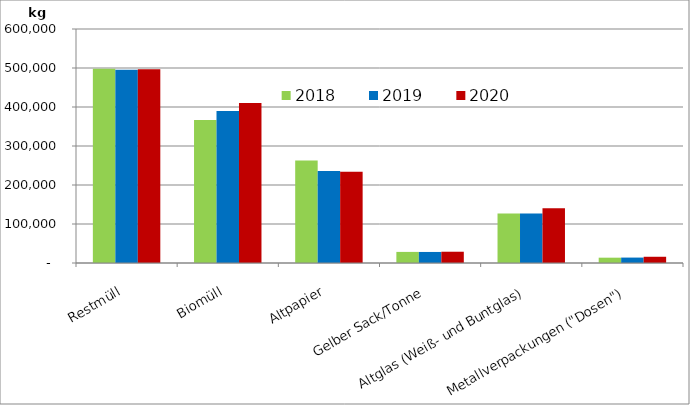
| Category | 2018 | 2019 | 2020 |
|---|---|---|---|
| Restmüll | 498240 | 495820 | 497090 |
| Biomüll | 366770 | 389800 | 409980 |
| Altpapier | 262510 | 235590 | 233760 |
| Gelber Sack/Tonne | 28446 | 28311 | 28904 |
| Altglas (Weiß- und Buntglas) | 127070 | 126770 | 140500 |
| Metallverpackungen ("Dosen") | 13642.254 | 13898.516 | 15980.43 |